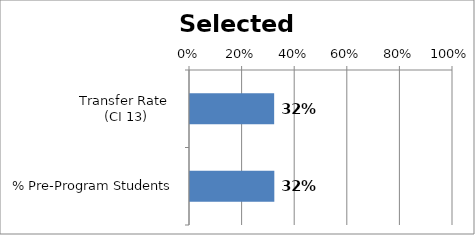
| Category | RAtes |
|---|---|
| Transfer Rate 
(CI 13) | 0.32 |
| % Pre-Program Students | 0.321 |